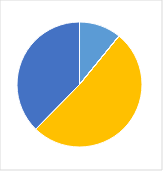
| Category | Series 0 |
|---|---|
| 0 | 0.109 |
| 1 | 0 |
| 2 | 0 |
| 3 | 0.514 |
| 4 | 0.377 |